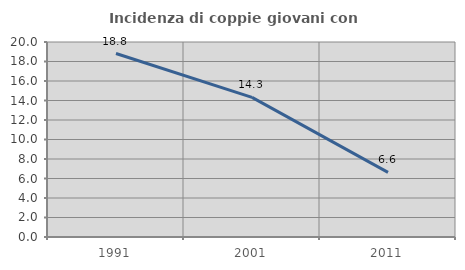
| Category | Incidenza di coppie giovani con figli |
|---|---|
| 1991.0 | 18.816 |
| 2001.0 | 14.318 |
| 2011.0 | 6.632 |